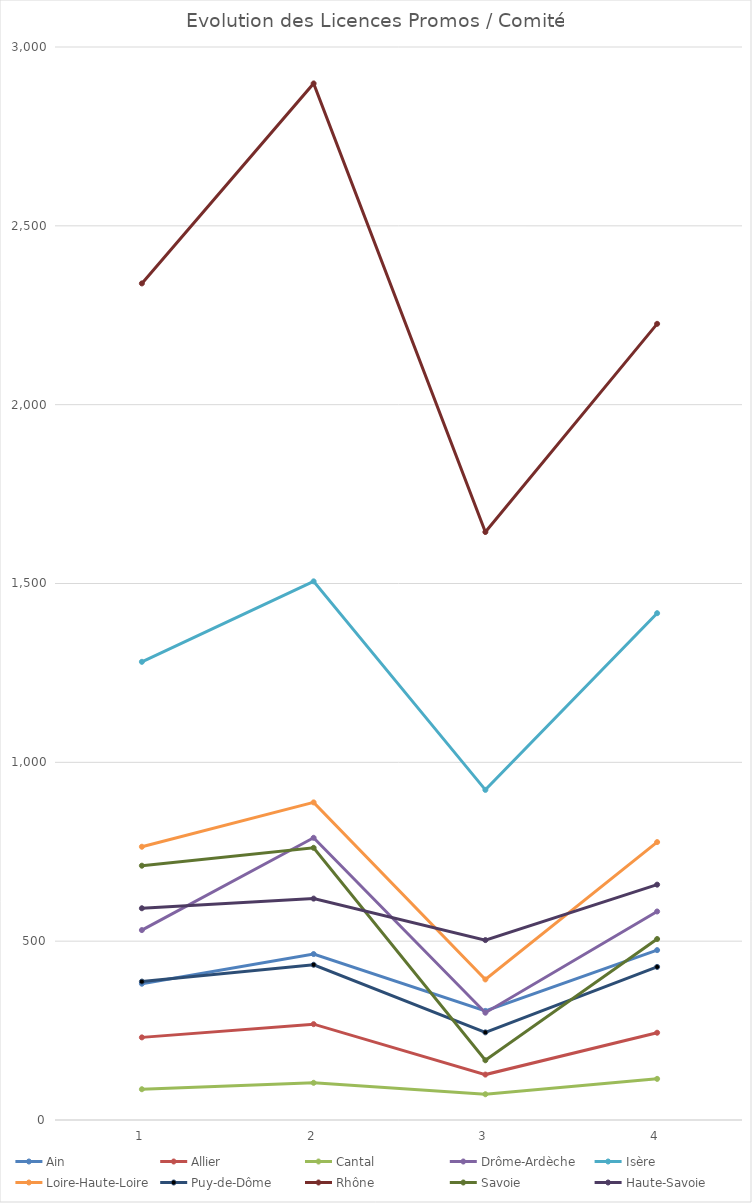
| Category | Ain | Allier | Cantal | Drôme-Ardèche | Isère | Loire-Haute-Loire | Puy-de-Dôme | Rhône | Savoie | Haute-Savoie |
|---|---|---|---|---|---|---|---|---|---|---|
| 0 | 381 | 231 | 86 | 531 | 1281 | 764 | 387 | 2339 | 711 | 592 |
| 1 | 464 | 268 | 104 | 789 | 1506 | 888 | 434 | 2898 | 761 | 619 |
| 2 | 305 | 127 | 72 | 300 | 923 | 393 | 245 | 1644 | 167 | 503 |
| 3 | 475 | 244 | 115 | 583 | 1417 | 777 | 428 | 2226 | 506 | 658 |